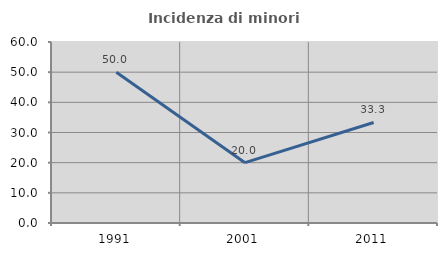
| Category | Incidenza di minori stranieri |
|---|---|
| 1991.0 | 50 |
| 2001.0 | 20 |
| 2011.0 | 33.333 |